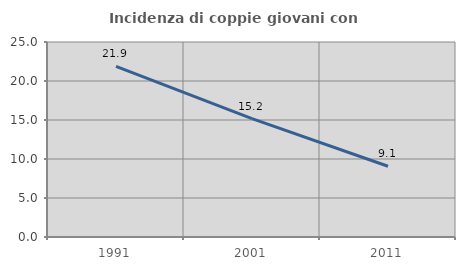
| Category | Incidenza di coppie giovani con figli |
|---|---|
| 1991.0 | 21.88 |
| 2001.0 | 15.172 |
| 2011.0 | 9.07 |